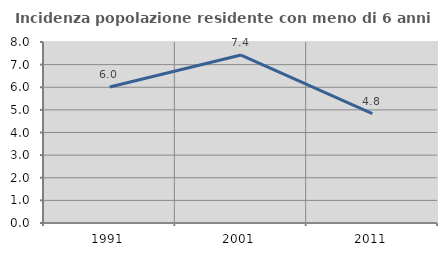
| Category | Incidenza popolazione residente con meno di 6 anni |
|---|---|
| 1991.0 | 6.01 |
| 2001.0 | 7.422 |
| 2011.0 | 4.833 |